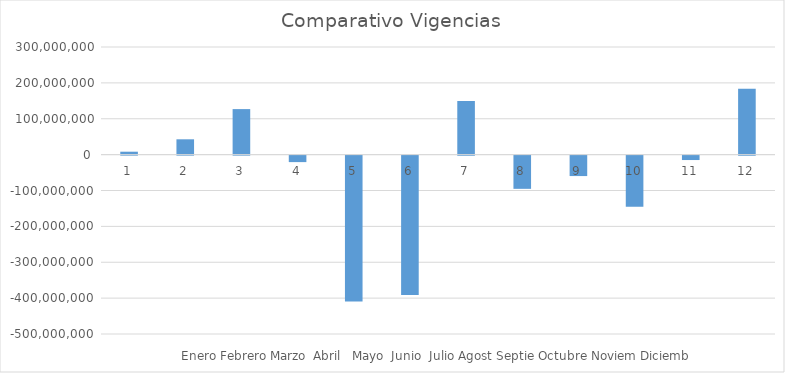
| Category | Series 0 |
|---|---|
| 0 | 8153170 |
| 1 | 42706315 |
| 2 | 126905331 |
| 3 | -18065849 |
| 4 | -406720237 |
| 5 | -388319305 |
| 6 | 149556956 |
| 7 | -92574193 |
| 8 | -56979636 |
| 9 | -142418094.8 |
| 10 | -12295966 |
| 11 | 183778347 |